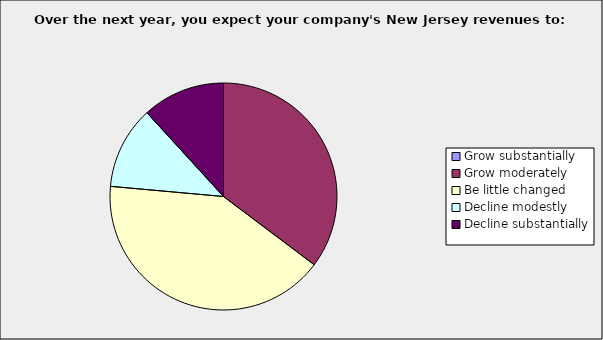
| Category | Series 0 |
|---|---|
| Grow substantially | 0 |
| Grow moderately | 0.353 |
| Be little changed | 0.412 |
| Decline modestly | 0.118 |
| Decline substantially | 0.118 |